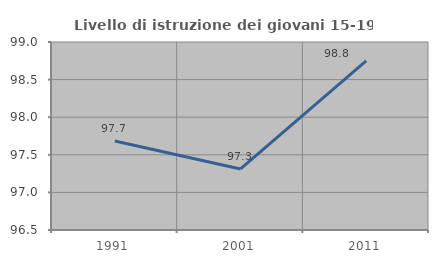
| Category | Livello di istruzione dei giovani 15-19 anni |
|---|---|
| 1991.0 | 97.683 |
| 2001.0 | 97.312 |
| 2011.0 | 98.75 |